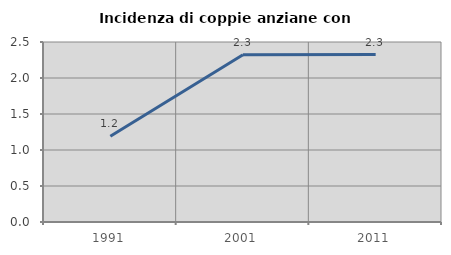
| Category | Incidenza di coppie anziane con figli |
|---|---|
| 1991.0 | 1.19 |
| 2001.0 | 2.323 |
| 2011.0 | 2.326 |